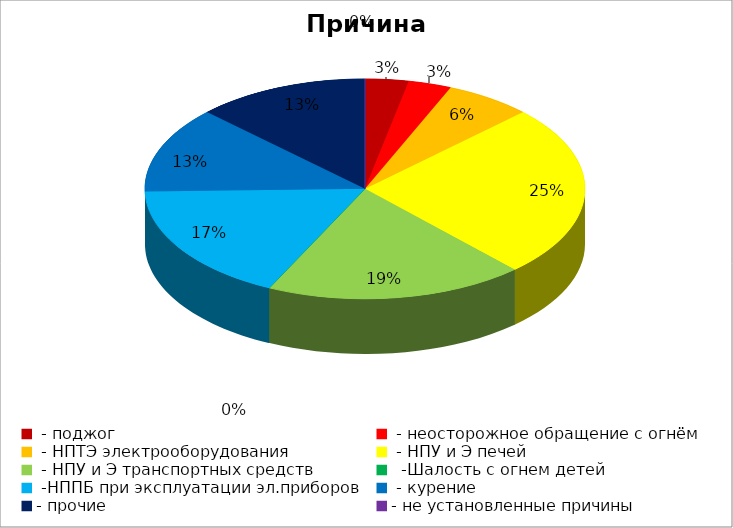
| Category | Причина пожара |
|---|---|
|  - поджог | 2 |
|  - неосторожное обращение с огнём | 2 |
|  - НПТЭ электрооборудования | 4 |
|  - НПУ и Э печей | 16 |
|  - НПУ и Э транспортных средств | 12 |
|   -Шалость с огнем детей | 0 |
|  -НППБ при эксплуатации эл.приборов | 11 |
|  - курение | 8 |
| - прочие | 8 |
| - не установленные причины | 0 |